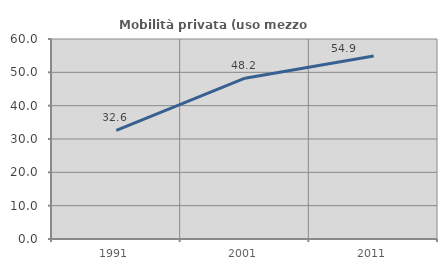
| Category | Mobilità privata (uso mezzo privato) |
|---|---|
| 1991.0 | 32.619 |
| 2001.0 | 48.244 |
| 2011.0 | 54.926 |